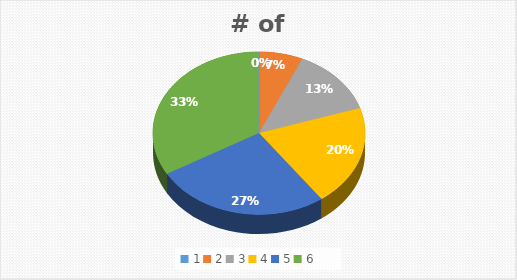
| Category | # of Siblings | Frequency |
|---|---|---|
| 0 | 0 | 0 |
| 1 | 1 | 8 |
| 2 | 2 | 9 |
| 3 | 3 | 5 |
| 4 | 4 | 0 |
| 5 | 5 | 1 |